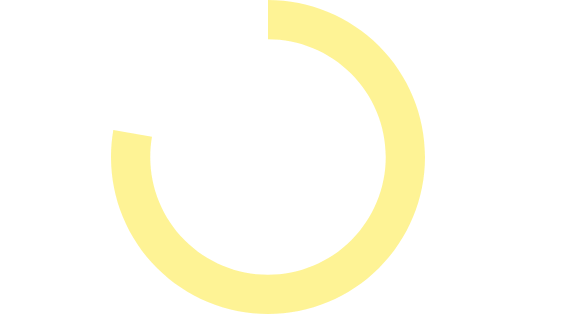
| Category | Series 0 |
|---|---|
| 0 | 0.777 |
| 1 | 0.223 |